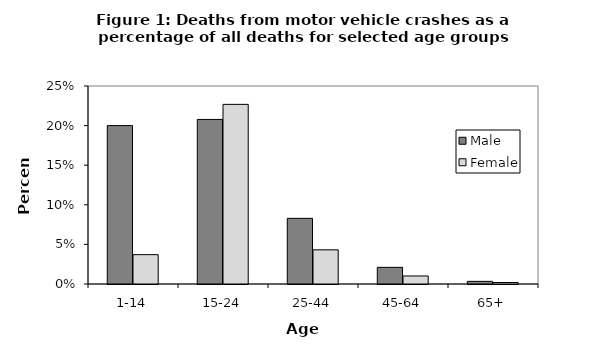
| Category | Male | Female |
|---|---|---|
| 1-14 | 0.2 | 0.037 |
| 15-24 | 0.208 | 0.227 |
| 25-44 | 0.083 | 0.043 |
| 45-64 | 0.021 | 0.01 |
| 65+ | 0.003 | 0.002 |